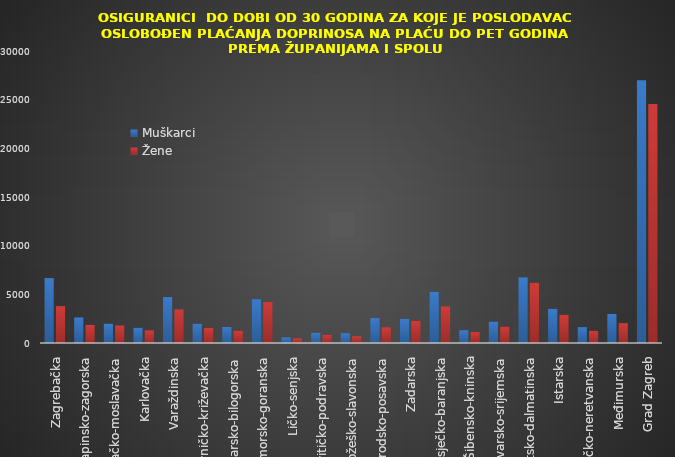
| Category | Muškarci | Žene |
|---|---|---|
| Zagrebačka | 6665 | 3791 |
| Krapinsko-zagorska | 2625 | 1856 |
| Sisačko-moslavačka | 1980 | 1801 |
| Karlovačka | 1570 | 1296 |
| Varaždinska | 4720 | 3446 |
| Koprivničko-križevačka | 1983 | 1540 |
| Bjelovarsko-bilogorska | 1645 | 1258 |
| Primorsko-goranska | 4498 | 4231 |
| Ličko-senjska | 582 | 477 |
| Virovitičko-podravska | 1069 | 841 |
| Požeško-slavonska | 1006 | 697 |
| Brodsko-posavska | 2559 | 1604 |
| Zadarska | 2481 | 2290 |
| Osječko-baranjska | 5270 | 3763 |
| Šibensko-kninska | 1314 | 1128 |
| Vukovarsko-srijemska | 2208 | 1691 |
| Splitsko-dalmatinska | 6744 | 6190 |
| Istarska | 3513 | 2889 |
| Dubrovačko-neretvanska | 1630 | 1262 |
| Međimurska | 2988 | 2040 |
| Grad Zagreb | 27001 | 24562 |